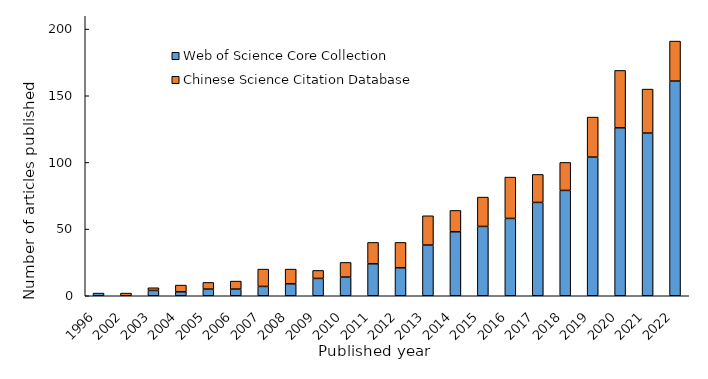
| Category | Web of Science Core Collection | Chinese Science Citation Database |
|---|---|---|
| 1996.0 | 2 | 0 |
| 2002.0 | 0 | 2 |
| 2003.0 | 4 | 2 |
| 2004.0 | 3 | 5 |
| 2005.0 | 5 | 5 |
| 2006.0 | 5 | 6 |
| 2007.0 | 7 | 13 |
| 2008.0 | 9 | 11 |
| 2009.0 | 13 | 6 |
| 2010.0 | 14 | 11 |
| 2011.0 | 24 | 16 |
| 2012.0 | 21 | 19 |
| 2013.0 | 38 | 22 |
| 2014.0 | 48 | 16 |
| 2015.0 | 52 | 22 |
| 2016.0 | 58 | 31 |
| 2017.0 | 70 | 21 |
| 2018.0 | 79 | 21 |
| 2019.0 | 104 | 30 |
| 2020.0 | 126 | 43 |
| 2021.0 | 122 | 33 |
| 2022.0 | 161 | 30 |